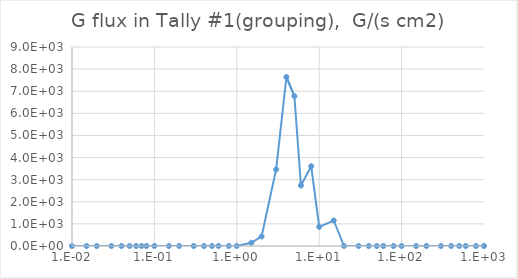
| Category | Series 0 |
|---|---|
| 0.01 | 0 |
| 0.015 | 0 |
| 0.02 | 0 |
| 0.03 | 0 |
| 0.04 | 0 |
| 0.05 | 0 |
| 0.06 | 0 |
| 0.07 | 0 |
| 0.08 | 0 |
| 0.1 | 0 |
| 0.15 | 0 |
| 0.2 | 0 |
| 0.3 | 0 |
| 0.4 | 0 |
| 0.5 | 0 |
| 0.6 | 0 |
| 0.8 | 0 |
| 1.0 | 0 |
| 1.5 | 3.166 |
| 2.0 | 9.497 |
| 3.0 | 75.978 |
| 4.0 | 167.784 |
| 5.0 | 148.789 |
| 6.0 | 60.149 |
| 8.0 | 79.143 |
| 10.0 | 18.994 |
| 15.0 | 25.326 |
| 20.0 | 0 |
| 30.0 | 0 |
| 40.0 | 0 |
| 50.0 | 0 |
| 60.0 | 0 |
| 80.0 | 0 |
| 100.0 | 0 |
| 150.0 | 0 |
| 200.0 | 0 |
| 300.0 | 0 |
| 400.0 | 0 |
| 500.0 | 0 |
| 600.0 | 0 |
| 800.0 | 0 |
| 1000.0 | 0 |
| 1500.0 | 0 |
| 2000.0 | 0 |
| 3000.0 | 0 |
| 4000.0 | 0 |
| 5000.0 | 0 |
| 6000.0 | 0 |
| 8000.0 | 0 |
| 10000.0 | 0 |